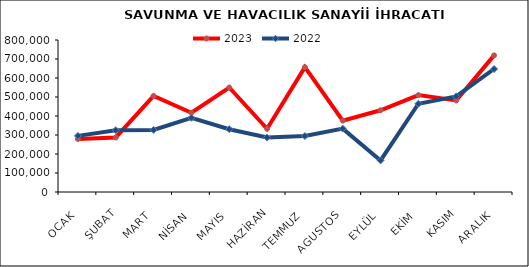
| Category | 2023 | 2022 |
|---|---|---|
| OCAK | 278884.949 | 295374.955 |
| ŞUBAT | 287110.675 | 325086.054 |
| MART | 505697.549 | 326941.749 |
| NİSAN | 417259.74 | 390461.098 |
| MAYIS | 549934.817 | 330384.316 |
| HAZİRAN | 332637.279 | 286911.482 |
| TEMMUZ | 657172.98 | 294368.009 |
| AGUSTOS | 375762.797 | 333532.235 |
| EYLÜL | 430282.388 | 166231.577 |
| EKİM | 509992.532 | 464523.283 |
| KASIM | 481780.405 | 503256.203 |
| ARALIK | 719105.493 | 647435.866 |